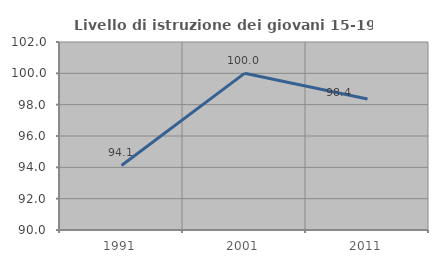
| Category | Livello di istruzione dei giovani 15-19 anni |
|---|---|
| 1991.0 | 94.118 |
| 2001.0 | 100 |
| 2011.0 | 98.361 |